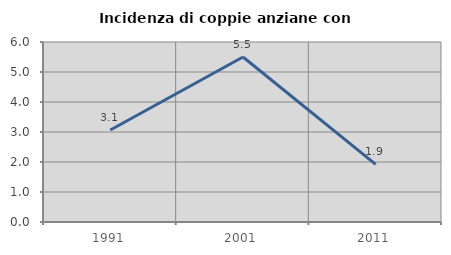
| Category | Incidenza di coppie anziane con figli |
|---|---|
| 1991.0 | 3.065 |
| 2001.0 | 5.5 |
| 2011.0 | 1.923 |